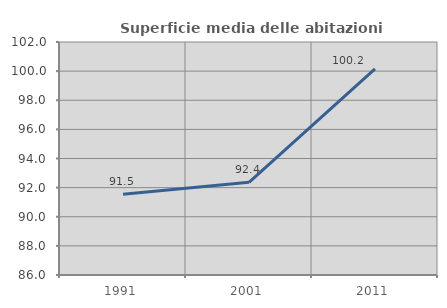
| Category | Superficie media delle abitazioni occupate |
|---|---|
| 1991.0 | 91.545 |
| 2001.0 | 92.364 |
| 2011.0 | 100.16 |